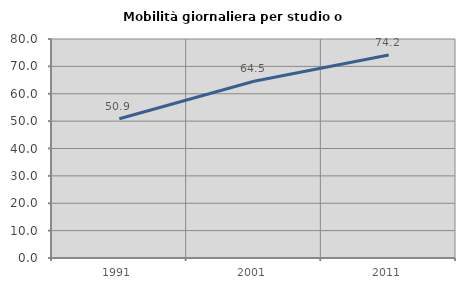
| Category | Mobilità giornaliera per studio o lavoro |
|---|---|
| 1991.0 | 50.883 |
| 2001.0 | 64.55 |
| 2011.0 | 74.155 |